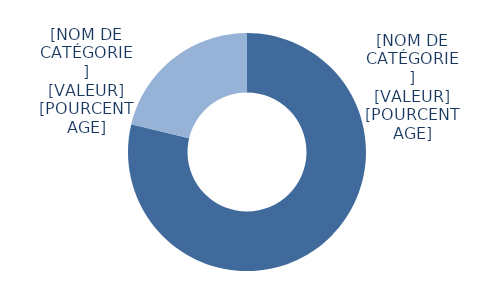
| Category | Series 0 |
|---|---|
| Formation de base | 14379 |
| Formation avancée | 3882 |